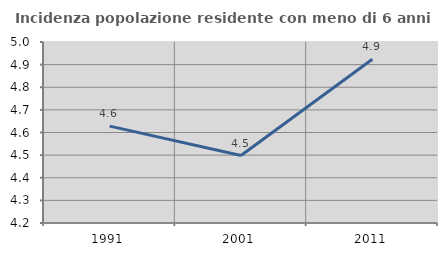
| Category | Incidenza popolazione residente con meno di 6 anni |
|---|---|
| 1991.0 | 4.628 |
| 2001.0 | 4.498 |
| 2011.0 | 4.924 |